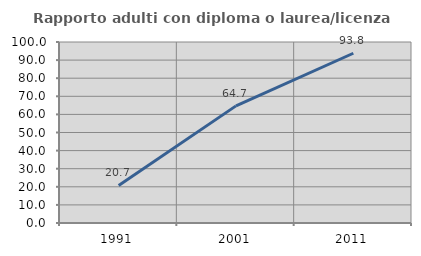
| Category | Rapporto adulti con diploma o laurea/licenza media  |
|---|---|
| 1991.0 | 20.721 |
| 2001.0 | 64.706 |
| 2011.0 | 93.782 |